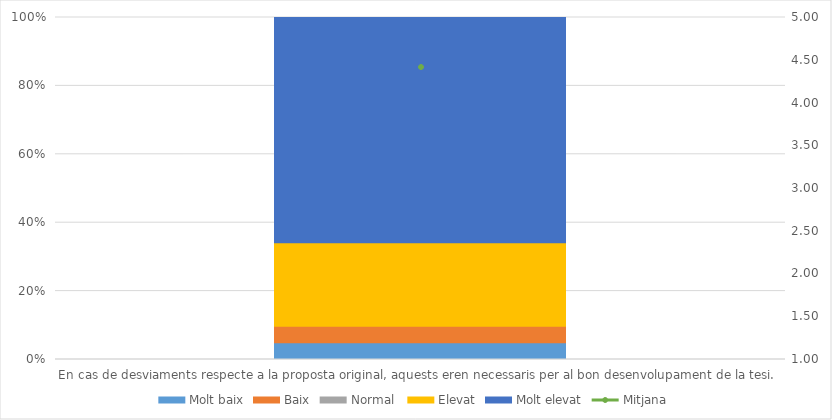
| Category | Molt baix | Baix | Normal  | Elevat | Molt elevat |
|---|---|---|---|---|---|
| En cas de desviaments respecte a la proposta original, aquests eren necessaris per al bon desenvolupament de la tesi. | 2 | 2 | 0 | 10 | 27 |